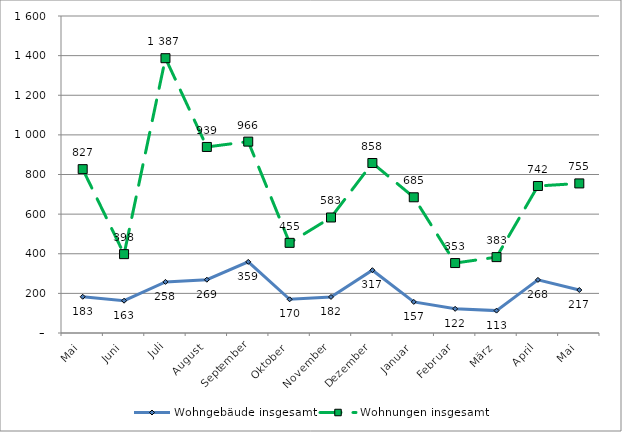
| Category | Wohngebäude insgesamt | Wohnungen insgesamt |
|---|---|---|
| Mai | 183 | 827 |
| Juni | 163 | 398 |
| Juli | 258 | 1387 |
| August | 269 | 939 |
| September | 359 | 966 |
| Oktober | 170 | 455 |
| November | 182 | 583 |
| Dezember | 317 | 858 |
| Januar | 157 | 685 |
| Februar | 122 | 353 |
| März | 113 | 383 |
| April | 268 | 742 |
| Mai | 217 | 755 |